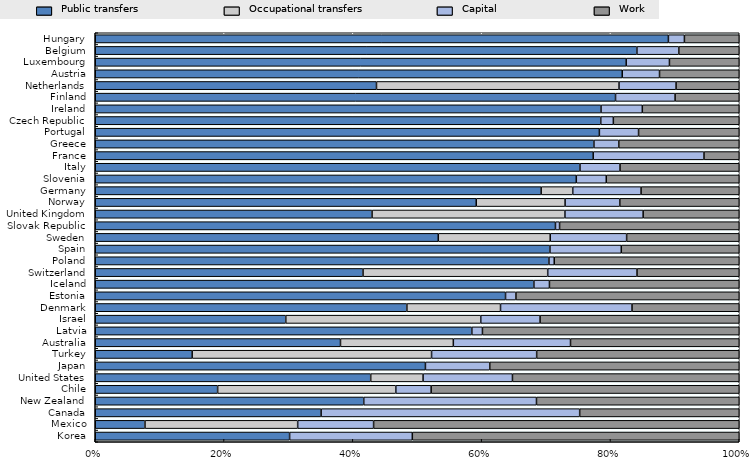
| Category | Public transfers | Occupational transfers | Capital | Work |
|---|---|---|---|---|
| Korea | 30.181 | 0 | 19.054 | 50.765 |
| Mexico | 7.723 | 23.71 | 11.789 | 56.778 |
| Canada | 35.072 | 0 | 40.149 | 24.779 |
| New Zealand | 41.693 | 0 | 26.819 | 31.488 |
| Chile | 19.006 | 27.666 | 5.488 | 47.841 |
| United States | 42.774 | 8.13 | 13.879 | 35.217 |
| Japan | 51.27 | 0 | 9.99 | 38.74 |
| Turkey | 15.052 | 37.171 | 16.318 | 31.459 |
| Australia | 38.081 | 17.522 | 18.196 | 26.201 |
| Latvia | 58.479 | 0 | 1.644 | 39.876 |
| Israel | 29.586 | 30.274 | 9.214 | 30.925 |
| Denmark | 48.391 | 14.539 | 20.417 | 16.653 |
| Estonia | 63.71 | 0 | 1.612 | 34.678 |
| Iceland | 68.113 | 0 | 2.415 | 29.473 |
| Switzerland | 41.583 | 28.674 | 13.867 | 15.876 |
| Poland | 70.448 | 0 | 0.824 | 28.728 |
| Spain | 70.605 | 0 | 11.079 | 18.316 |
| Sweden | 53.267 | 17.381 | 11.865 | 17.487 |
| Slovak Republic | 71.462 | 0 | 0.637 | 27.901 |
| United Kingdom | 42.983 | 29.949 | 12.144 | 14.924 |
| Norway | 59.16 | 13.797 | 8.495 | 18.548 |
| Germany | 69.242 | 4.903 | 10.609 | 15.246 |
| Slovenia | 74.697 | 0 | 4.655 | 20.648 |
| Italy | 75.269 | 0 | 6.214 | 18.517 |
| France | 77.322 | 0 | 17.204 | 5.474 |
| Greece | 77.434 | 0 | 3.858 | 18.708 |
| Portugal | 78.282 | 0 | 6.082 | 15.636 |
| Czech Republic | 78.495 | 0 | 1.954 | 19.551 |
| Ireland | 78.537 | 0 | 6.411 | 15.052 |
| Finland | 80.789 | 0 | 9.247 | 9.964 |
| Netherlands | 43.671 | 37.658 | 8.861 | 9.81 |
| Austria | 81.832 | 0 | 5.788 | 12.38 |
| Luxembourg | 82.444 | 0 | 6.716 | 10.84 |
| Belgium | 84.109 | 0 | 6.505 | 9.386 |
| Hungary | 88.999 | 0 | 2.487 | 8.514 |